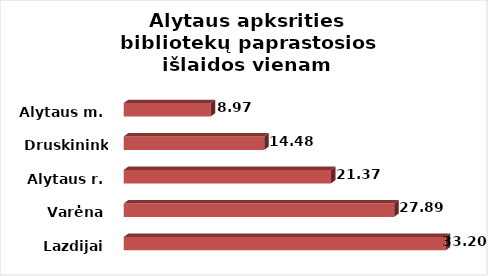
| Category | Series 0 |
|---|---|
| Lazdijai | 33.2 |
| Varėna | 27.892 |
| Alytaus r. | 21.372 |
| Druskininkai | 14.48 |
| Alytaus m. | 8.973 |